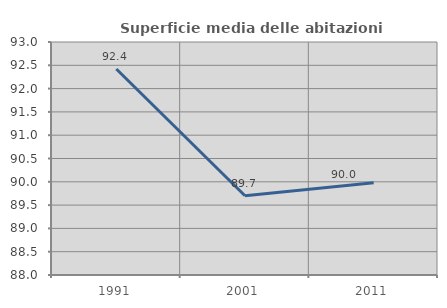
| Category | Superficie media delle abitazioni occupate |
|---|---|
| 1991.0 | 92.42 |
| 2001.0 | 89.701 |
| 2011.0 | 89.98 |